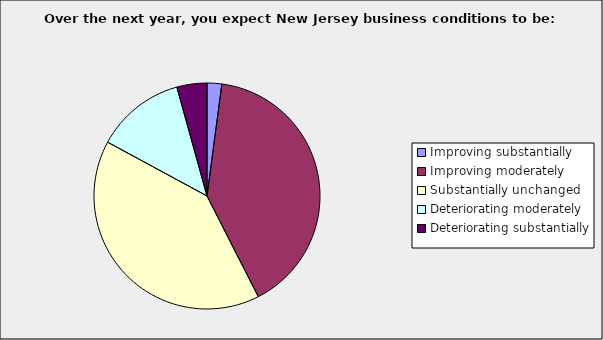
| Category | Series 0 |
|---|---|
| Improving substantially | 0.021 |
| Improving moderately | 0.404 |
| Substantially unchanged | 0.404 |
| Deteriorating moderately | 0.128 |
| Deteriorating substantially | 0.043 |